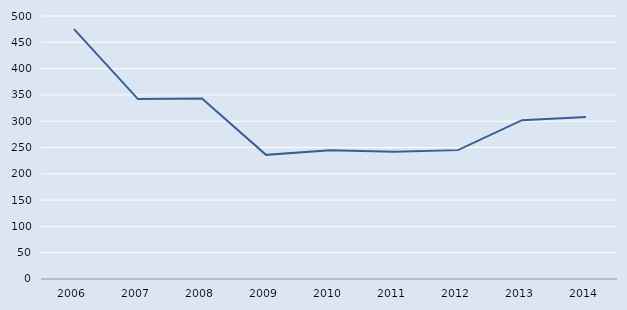
| Category | Series 0 |
|---|---|
| 2006.0 | 475 |
| 2007.0 | 342 |
| 2008.0 | 343 |
| 2009.0 | 236 |
| 2010.0 | 245 |
| 2011.0 | 242 |
| 2012.0 | 245 |
| 2013.0 | 302 |
| 2014.0 | 308 |